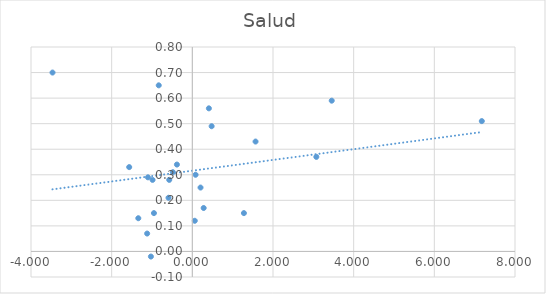
| Category | Salud |
|---|---|
| 0.06052582200249956 | 0.12 |
| -1.339539147515001 | 0.13 |
| -1.1203229332582998 | 0.07 |
| -0.9862037445886013 | 0.28 |
| -3.4662710747771994 | 0.7 |
| 0.4103518494638997 | 0.56 |
| -1.5653149541481977 | 0.33 |
| 1.5673496706761991 | 0.43 |
| 7.1770364527009995 | 0.51 |
| 0.47884246635880034 | 0.49 |
| -0.832734952533401 | 0.65 |
| 3.4562493478376117 | 0.59 |
| 0.28079979651694786 | 0.17 |
| -0.5906758229193689 | 0.21 |
| -0.38208630553888956 | 0.34 |
| -0.5726169698249004 | 0.28 |
| 0.08025158798270066 | 0.3 |
| 1.2789830493301095 | 0.15 |
| -1.1005497828799102 | 0.29 |
| 0.20330044603610042 | 0.25 |
| -0.48222478231940147 | 0.31 |
| -0.9518304220709997 | 0.15 |
| -1.027059621055 | -0.02 |
| 3.074367518631871 | 0.37 |